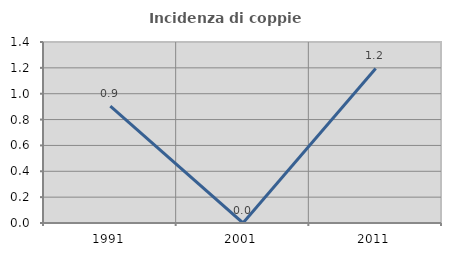
| Category | Incidenza di coppie miste |
|---|---|
| 1991.0 | 0.904 |
| 2001.0 | 0 |
| 2011.0 | 1.195 |